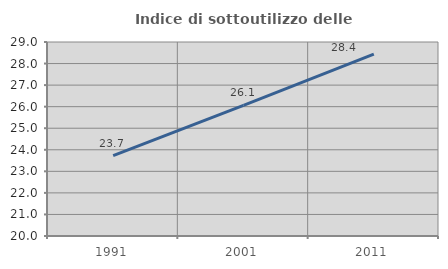
| Category | Indice di sottoutilizzo delle abitazioni  |
|---|---|
| 1991.0 | 23.729 |
| 2001.0 | 26.059 |
| 2011.0 | 28.438 |